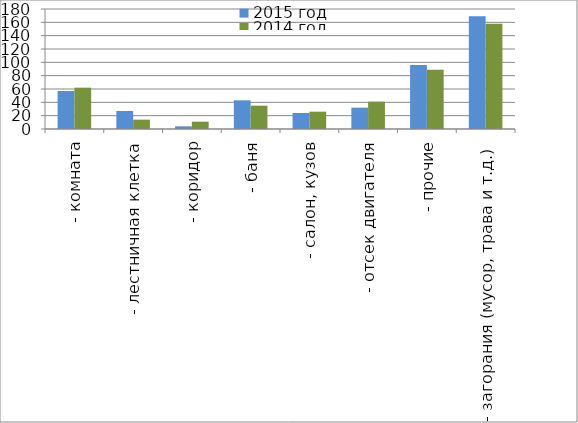
| Category | 2015 год | 2014 год |
|---|---|---|
|  - комната | 57 | 62 |
|  - лестничная клетка | 27 | 14 |
|  - коридор | 4 | 11 |
|  - баня | 43 | 35 |
|  - салон, кузов | 24 | 26 |
|  - отсек двигателя | 32 | 41 |
| - прочие | 96 | 89 |
| - загорания (мусор, трава и т.д.)  | 169 | 158 |